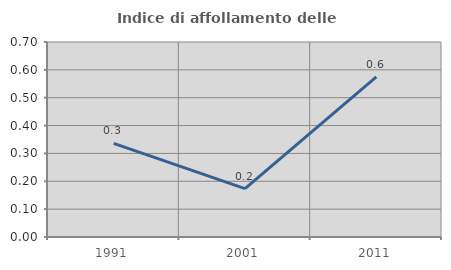
| Category | Indice di affollamento delle abitazioni  |
|---|---|
| 1991.0 | 0.336 |
| 2001.0 | 0.173 |
| 2011.0 | 0.575 |